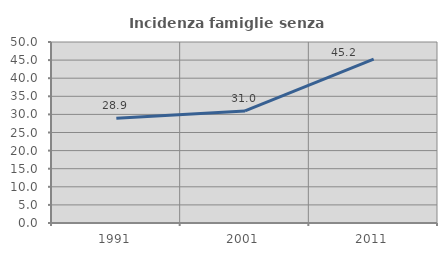
| Category | Incidenza famiglie senza nuclei |
|---|---|
| 1991.0 | 28.91 |
| 2001.0 | 30.96 |
| 2011.0 | 45.243 |